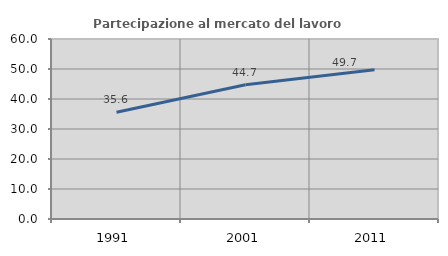
| Category | Partecipazione al mercato del lavoro  femminile |
|---|---|
| 1991.0 | 35.556 |
| 2001.0 | 44.742 |
| 2011.0 | 49.728 |